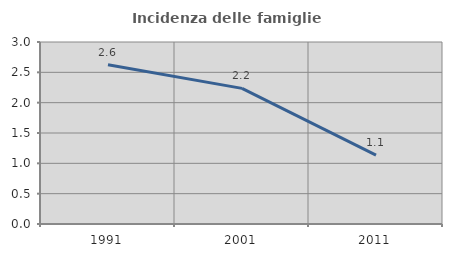
| Category | Incidenza delle famiglie numerose |
|---|---|
| 1991.0 | 2.625 |
| 2001.0 | 2.236 |
| 2011.0 | 1.135 |